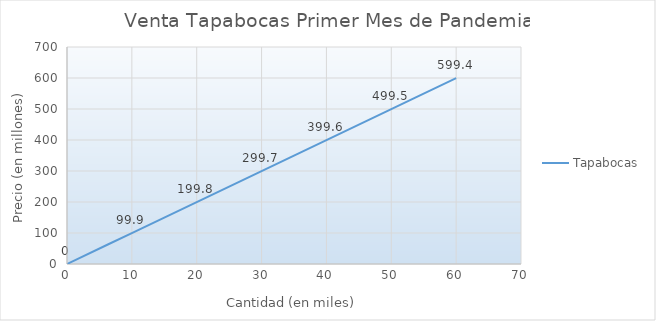
| Category | Tapabocas |
|---|---|
| 0.0 | 0 |
| 10.0 | 99.9 |
| 20.0 | 199.8 |
| 30.0 | 299.7 |
| 40.0 | 399.6 |
| 50.0 | 499.5 |
| 60.0 | 599.4 |